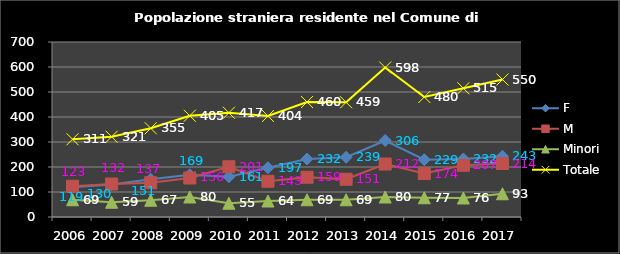
| Category | F | M | Minori | Totale |
|---|---|---|---|---|
| 2006.0 | 119 | 123 | 69 | 311 |
| 2007.0 | 130 | 132 | 59 | 321 |
| 2008.0 | 151 | 137 | 67 | 355 |
| 2009.0 | 169 | 156 | 80 | 405 |
| 2010.0 | 161 | 201 | 55 | 417 |
| 2011.0 | 197 | 143 | 64 | 404 |
| 2012.0 | 232 | 159 | 69 | 460 |
| 2013.0 | 239 | 151 | 69 | 459 |
| 2014.0 | 306 | 212 | 80 | 598 |
| 2015.0 | 229 | 174 | 77 | 480 |
| 2016.0 | 232 | 207 | 76 | 515 |
| 2017.0 | 243 | 214 | 93 | 550 |